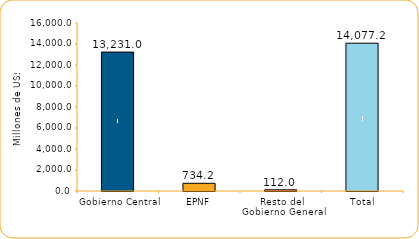
| Category | Series 1 |
|---|---|
| Gobierno Central | 13231 |
| EPNF | 734.2 |
| Resto del Gobierno General | 112 |
| Total | 14077.2 |